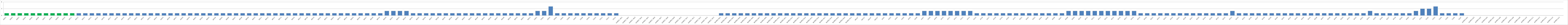
| Category | Series 0 |
|---|---|
| AW01 | 1 |
| AW02 | 1 |
| AW03 | 1 |
| AW04 | 1 |
| AW05 | 1 |
| AW06 | 1 |
| AW07 | 1 |
| AW08 | 1 |
| AW09 | 1 |
| AW10 | 1 |
| AW11 | 1 |
| AW12 | 1 |
| AW13 | 1 |
| AW14 | 1 |
| AW15 | 1 |
| AW16 | 1 |
| AW17 | 1 |
| AW18 | 1 |
| AW19 | 1 |
| AW20 | 1 |
| AW21 | 1 |
| AW22 | 1 |
| AW23 | 1 |
| AW24 | 1 |
| AW25 | 1 |
| AW26 | 1 |
| AW27 | 1 |
| AW28 | 1 |
| AW29 | 1 |
| BW01 | 1 |
| BW02 | 1 |
| BW03 | 1 |
| BWO4 | 1 |
| BW05 | 1 |
| BW06 | 1 |
| BW07 | 1 |
| BW08 | 1 |
| BW09 | 1 |
| BW10 | 1 |
| BW11 | 1 |
| BW12 | 1 |
| BW13 | 1 |
| BW14 | 1 |
| BW15 | 1 |
| BW16 | 1 |
| BW17 | 1 |
| BW18 | 1 |
| BW19 | 1 |
| BW20 | 1 |
| BW21 | 1 |
| BW22 | 1 |
| BW23 | 1 |
| BW24 | 1 |
| BW25 | 1 |
| BW26 | 1 |
| BW27 | 1 |
| BW28 | 1 |
| BW29 | 1 |
| BW30 | 2 |
| BW31 | 2 |
| BW32 | 2 |
| BW33 | 2 |
| BW34 | 1 |
| BW35 | 1 |
| BW36 | 1 |
| BW37 | 1 |
| BW38 | 1 |
| BW39 | 1 |
| BW40 | 1 |
| BW41 | 1 |
| BW42 | 1 |
| BW43 | 1 |
| BW44 | 1 |
| BW45 | 1 |
| BW46 | 1 |
| BW47 | 1 |
| BW48 | 1 |
| BW49 | 1 |
| BW50 | 1 |
| BW51 | 1 |
| BW52 | 1 |
| CW01 | 2 |
| CW02 | 2 |
| CW03 | 4 |
| CW04 | 1 |
| CW05 | 1 |
| CW06 | 1 |
| CW07 | 1 |
| CW08 | 1 |
| CW09 | 1 |
| CW10 | 1 |
| CW11 | 1 |
| CW12 | 1 |
| CW13 | 1 |
| AUMED. W01 | 0 |
| AUMED. W02 | 0 |
| AUMED. W03 | 0 |
| AUMED. W04 | 0 |
| AUMED. W05 | 0 |
| AUMED. W06 | 0 |
| AUMED. W07 | 0 |
| AUMED. W08 | 0 |
| AUMED.W09 | 0 |
| AUMED. W10 | 0 |
| AUMED. W11 | 0 |
| AUMED. W12 | 0 |
| AUMED. W13 | 0 |
| AUMED. W14 | 0 |
| AUMED. W15 | 0 |
| BUMED.W01 | 1 |
| BUMED.W02 | 1 |
| BUMED.W03 | 1 |
| BUMED.W04 | 1 |
| BUMED.W05 | 1 |
| BUMED.W06 | 1 |
| BUMED.W07 | 1 |
| BUMED.W08 | 1 |
| BUMED.W09 | 1 |
| BUMED.W10 | 1 |
| BUMED.W11 | 1 |
| BUMED.W12 | 1 |
| BUMED.W13 | 1 |
| BUMED.W14 | 1 |
| BUMED.W15 | 1 |
| BUMED.W16 | 1 |
| BUMED.W17 | 1 |
| BUMED.W18 | 1 |
| BUMED.W19 | 1 |
| BUMED.W20 | 1 |
| BUMED.W21 | 1 |
| AW22* | 1 |
| AW23* | 1 |
| AW24* | 1 |
| AW25* | 1 |
| AU01 | 1 |
| AU02 | 1 |
| AU03 | 1 |
| AU04 | 1 |
| AU05 | 1 |
| AU06 | 1 |
| AU07 | 2 |
| AU08 | 2 |
| AU09 | 2 |
| AU10 | 2 |
| AU11 | 2 |
| AU12 | 2 |
| AU13 | 2 |
| AU14 | 2 |
| AU15 | 1 |
| AU16 | 1 |
| AU17 | 1 |
| AU18 | 1 |
| AU19 | 1 |
| AU20 | 1 |
| AU21 | 1 |
| BU01 | 1 |
| BU02 | 1 |
| BU03 | 1 |
| BU04 | 1 |
| BU05 | 1 |
| BU06 | 1 |
| BU07 | 1 |
| BU08 | 2 |
| BU09 | 2 |
| BU10 | 2 |
| BU11 | 2 |
| BU12 | 2 |
| BU13 | 2 |
| BU14 | 2 |
| BU15 | 2 |
| BU16 | 2 |
| BU17 | 2 |
| BU18 | 2 |
| BU19 | 1 |
| BU20 | 1 |
| BU21 | 1 |
| BU22 | 1 |
| BU23 | 1 |
| BU24 | 1 |
| BU25 | 1 |
| BU26 | 1 |
| BU27 | 1 |
| BU28 | 1 |
| BU29 | 1 |
| BU30 | 1 |
| BU31 | 1 |
| BU32 | 1 |
| BU33 | 2 |
| BU34 | 1 |
| BU35 | 1 |
| BU36 | 1 |
| BU37 | 1 |
| BU38 | 1 |
| BU39 | 1 |
| BU40 | 1 |
| BU41 | 1 |
| BU42 | 1 |
| BU43 | 1 |
| BU44 | 1 |
| BU45 | 1 |
| BU46 | 1 |
| BU47 | 1 |
| BU48 | 1 |
| BU49 | 1 |
| BU50 | 1 |
| BU51 | 1 |
| BU52 | 1 |
| BU53 | 1 |
| BU54 | 2 |
| BU55 | 1 |
| BU56 | 1 |
| BU57 | 1 |
| BU58 | 1 |
| BU59 | 1 |
| BU60 | 1 |
| BU61 | 2 |
| CU01 | 3 |
| CU02 | 3 |
| CU03 | 4 |
| CU04 | 1 |
| CU05 | 1 |
| CU06 | 1 |
| CU07 | 1 |
| AUMED.U01 | 0 |
| AUMED.U02 | 0 |
| AUMED.U03 | 0 |
| AUMED.U04 | 0 |
| AUMED.U05 | 0 |
| AUMED.U06 | 0 |
| AUMED.U07 | 0 |
| AUMED.U08 | 0 |
| AUMED.U09 | 0 |
| AUMED.U10 | 0 |
| AUMED.U11 | 0 |
| AUMED.U12 | 0 |
| AUMED.U13 | 0 |
| AUMED.U14 | 0 |
| AUMED.U15 | 0 |